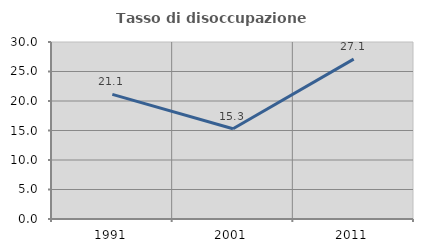
| Category | Tasso di disoccupazione giovanile  |
|---|---|
| 1991.0 | 21.123 |
| 2001.0 | 15.306 |
| 2011.0 | 27.105 |